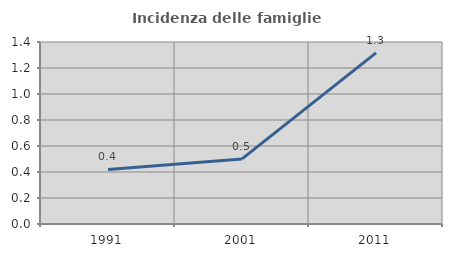
| Category | Incidenza delle famiglie numerose |
|---|---|
| 1991.0 | 0.42 |
| 2001.0 | 0.501 |
| 2011.0 | 1.316 |